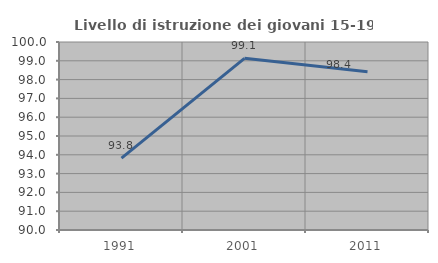
| Category | Livello di istruzione dei giovani 15-19 anni |
|---|---|
| 1991.0 | 93.82 |
| 2001.0 | 99.13 |
| 2011.0 | 98.413 |